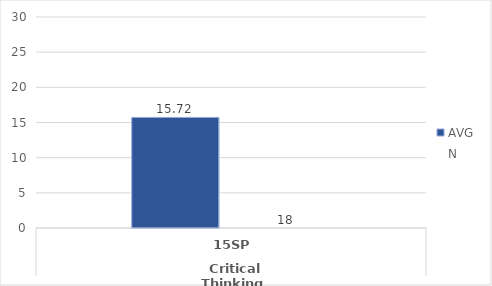
| Category | English - AVG | English - N |
|---|---|---|
| 0 | 15.722 | 18 |